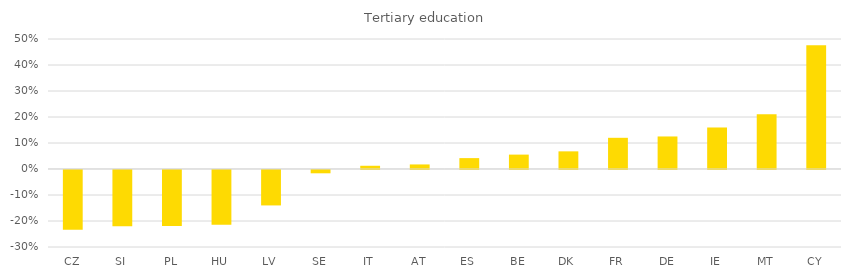
| Category | Tertiary education, change in students 2013-2018 |
|---|---|
| CZ | -0.23 |
| SI | -0.217 |
| PL | -0.215 |
| HU | -0.211 |
| LV | -0.136 |
| SE | -0.013 |
| IT | 0.012 |
| AT | 0.018 |
| ES | 0.042 |
| BE | 0.055 |
| DK | 0.068 |
| FR | 0.12 |
| DE | 0.125 |
| IE | 0.159 |
| MT | 0.21 |
| CY | 0.476 |